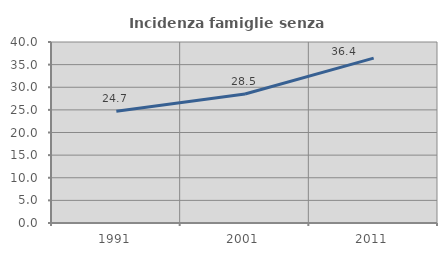
| Category | Incidenza famiglie senza nuclei |
|---|---|
| 1991.0 | 24.691 |
| 2001.0 | 28.508 |
| 2011.0 | 36.434 |